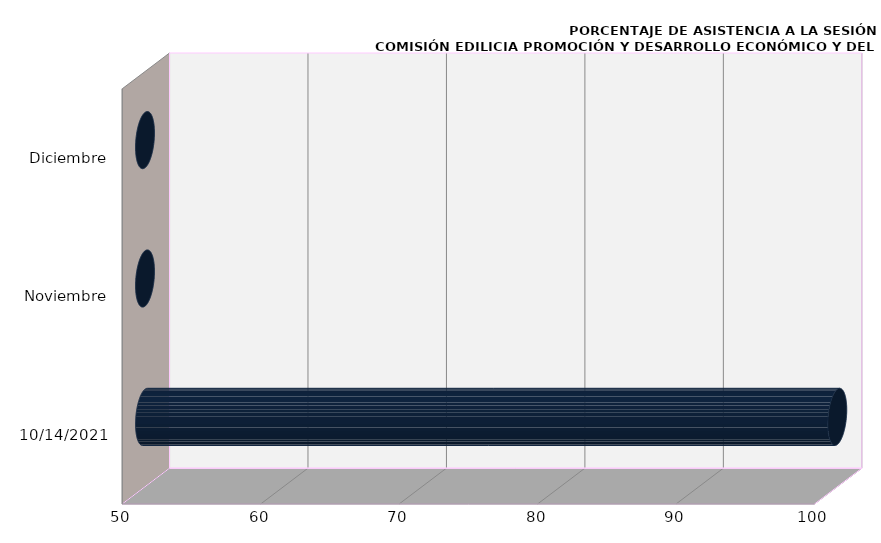
| Category | Series 0 |
|---|---|
| 14/10/2021 | 100 |
| Noviembre | 0 |
| Diciembre | 0 |